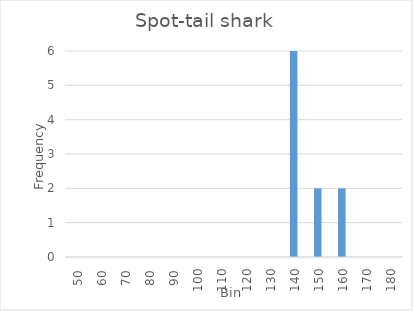
| Category | Frequency |
|---|---|
| 50.0 | 0 |
| 60.0 | 0 |
| 70.0 | 0 |
| 80.0 | 0 |
| 90.0 | 0 |
| 100.0 | 0 |
| 110.0 | 0 |
| 120.0 | 0 |
| 130.0 | 0 |
| 140.0 | 6 |
| 150.0 | 2 |
| 160.0 | 2 |
| 170.0 | 0 |
| 180.0 | 0 |